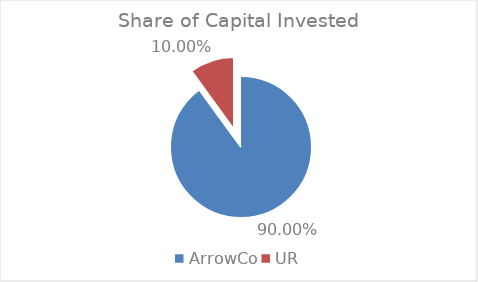
| Category | Series 0 |
|---|---|
| ArrowCo | 0.9 |
| UR | 0.1 |